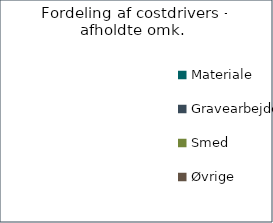
| Category | Series 0 | Andel af endelig anlægssum  |
|---|---|---|
| Materiale  |  | 0 |
| Gravearbejde |  | 0 |
| Smed |  | 0 |
| Øvrige  |  | 0 |